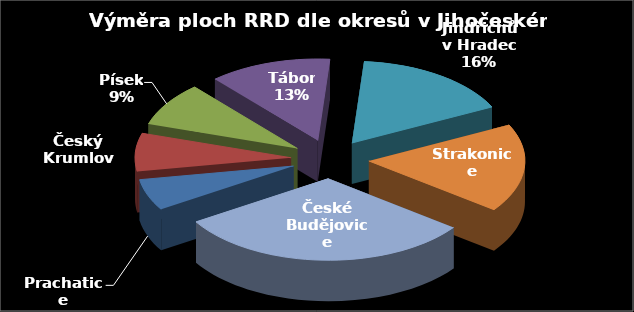
| Category | Výměra [ha] |
|---|---|
| Prachatice | 13.95 |
| Český Krumlov | 16.91 |
| Písek | 19.56 |
| Tábor | 28.46 |
| Jindřichův Hradec | 37.01 |
| Strakonice | 39.25 |
| České Budějovice | 69.42 |